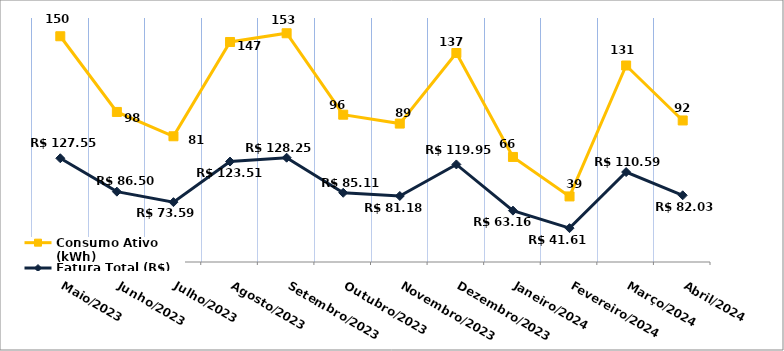
| Category | Fatura Total (R$) | Consumo Ativo (kWh) |
|---|---|---|
| Maio/2023 | 127.55 | 150 |
| Junho/2023 | 86.5 | 98 |
| Julho/2023 | 73.59 | 81 |
| Agosto/2023 | 123.51 | 147 |
| Setembro/2023 | 128.25 | 153 |
| Outubro/2023 | 85.11 | 96 |
| Novembro/2023 | 81.18 | 89 |
| Dezembro/2023 | 119.95 | 137 |
| Janeiro/2024 | 63.16 | 66 |
| Fevereiro/2024 | 41.61 | 39 |
| Março/2024 | 110.59 | 131 |
| Abril/2024 | 82.03 | 92 |